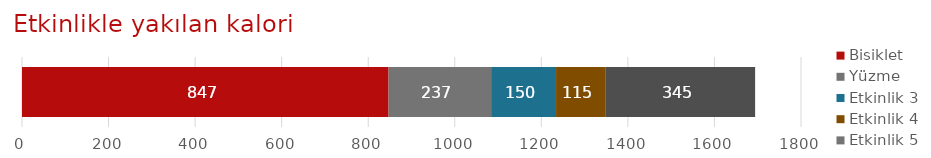
| Category | Bisiklet | Yüzme | Etkinlik 3 | Etkinlik 4 | Etkinlik 5 |
|---|---|---|---|---|---|
| Etkinlik İzleyicisi | 847 | 237 | 150 | 115 | 345 |